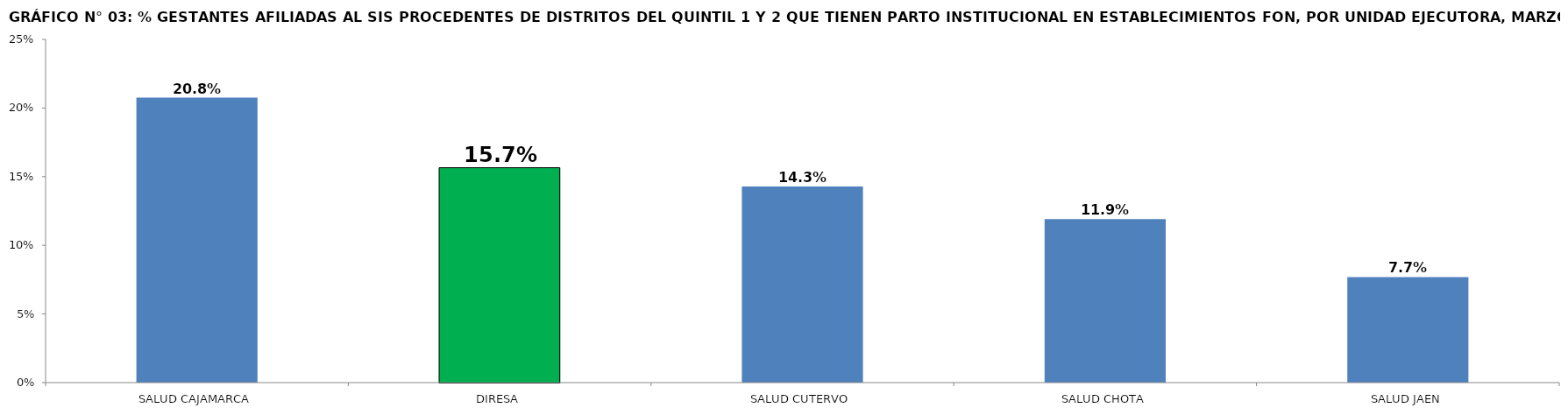
| Category | % GESTANTES AFILIADAS AL SIS PROCEDENTES DE DISTRITOS DEL QUINTIL 1 Y 2 QUE TIENEN PARTO INSTITUCIONAL EN ESTABLECIMIENTOS FON |
|---|---|
| SALUD CAJAMARCA | 0.208 |
| DIRESA | 0.157 |
| SALUD CUTERVO | 0.143 |
| SALUD CHOTA | 0.119 |
| SALUD JAEN | 0.077 |